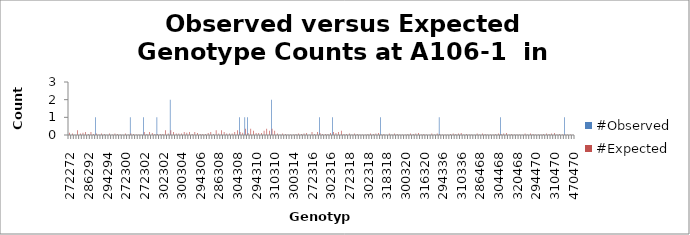
| Category | #Observed | #Expected |
|---|---|---|
| 272272.0 | 0 | 0.132 |
| 272286.0 | 0 | 0.088 |
| 286286.0 | 0 | 0.015 |
| 272290.0 | 0 | 0.265 |
| 286290.0 | 0 | 0.088 |
| 290290.0 | 0 | 0.132 |
| 272292.0 | 0 | 0.176 |
| 286292.0 | 0 | 0.059 |
| 290292.0 | 0 | 0.176 |
| 292292.0 | 0 | 0.059 |
| 272294.0 | 1 | 0.088 |
| 286294.0 | 0 | 0.029 |
| 290294.0 | 0 | 0.088 |
| 292294.0 | 0 | 0.059 |
| 294294.0 | 0 | 0.015 |
| 272296.0 | 0 | 0.088 |
| 286296.0 | 0 | 0.029 |
| 290296.0 | 0 | 0.088 |
| 292296.0 | 0 | 0.059 |
| 294296.0 | 0 | 0.029 |
| 296296.0 | 0 | 0.015 |
| 272300.0 | 0 | 0.088 |
| 286300.0 | 0 | 0.029 |
| 290300.0 | 1 | 0.088 |
| 292300.0 | 0 | 0.059 |
| 294300.0 | 0 | 0.029 |
| 296300.0 | 0 | 0.029 |
| 300300.0 | 0 | 0.015 |
| 272302.0 | 1 | 0.176 |
| 286302.0 | 0 | 0.059 |
| 290302.0 | 0 | 0.176 |
| 292302.0 | 0 | 0.118 |
| 294302.0 | 0 | 0.059 |
| 296302.0 | 1 | 0.059 |
| 300302.0 | 0 | 0.059 |
| 302302.0 | 0 | 0.059 |
| 272304.0 | 0 | 0.265 |
| 286304.0 | 0 | 0.088 |
| 290304.0 | 2 | 0.265 |
| 292304.0 | 0 | 0.176 |
| 294304.0 | 0 | 0.088 |
| 296304.0 | 0 | 0.088 |
| 300304.0 | 0 | 0.088 |
| 302304.0 | 0 | 0.176 |
| 304304.0 | 0 | 0.132 |
| 272306.0 | 0 | 0.176 |
| 286306.0 | 0 | 0.059 |
| 290306.0 | 0 | 0.176 |
| 292306.0 | 0 | 0.118 |
| 294306.0 | 0 | 0.059 |
| 296306.0 | 0 | 0.059 |
| 300306.0 | 0 | 0.059 |
| 302306.0 | 0 | 0.118 |
| 304306.0 | 0 | 0.176 |
| 306306.0 | 0 | 0.059 |
| 272308.0 | 0 | 0.265 |
| 286308.0 | 0 | 0.088 |
| 290308.0 | 0 | 0.265 |
| 292308.0 | 0 | 0.176 |
| 294308.0 | 0 | 0.088 |
| 296308.0 | 0 | 0.088 |
| 300308.0 | 0 | 0.088 |
| 302308.0 | 0 | 0.176 |
| 304308.0 | 0 | 0.265 |
| 306308.0 | 1 | 0.176 |
| 308308.0 | 0 | 0.132 |
| 272310.0 | 1 | 0.353 |
| 286310.0 | 1 | 0.118 |
| 290310.0 | 0 | 0.353 |
| 292310.0 | 0 | 0.235 |
| 294310.0 | 0 | 0.118 |
| 296310.0 | 0 | 0.118 |
| 300310.0 | 0 | 0.118 |
| 302310.0 | 0 | 0.235 |
| 304310.0 | 0 | 0.353 |
| 306310.0 | 0 | 0.235 |
| 308310.0 | 2 | 0.353 |
| 310310.0 | 0 | 0.235 |
| 272314.0 | 0 | 0.088 |
| 286314.0 | 0 | 0.029 |
| 290314.0 | 0 | 0.088 |
| 292314.0 | 0 | 0.059 |
| 294314.0 | 0 | 0.029 |
| 296314.0 | 0 | 0.029 |
| 300314.0 | 0 | 0.029 |
| 302314.0 | 0 | 0.059 |
| 304314.0 | 0 | 0.088 |
| 306314.0 | 0 | 0.059 |
| 308314.0 | 0 | 0.088 |
| 310314.0 | 0 | 0.118 |
| 314314.0 | 0 | 0.015 |
| 272316.0 | 0 | 0.176 |
| 286316.0 | 0 | 0.059 |
| 290316.0 | 0 | 0.176 |
| 292316.0 | 1 | 0.118 |
| 294316.0 | 0 | 0.059 |
| 296316.0 | 0 | 0.059 |
| 300316.0 | 0 | 0.059 |
| 302316.0 | 0 | 0.118 |
| 304316.0 | 1 | 0.176 |
| 306316.0 | 0 | 0.118 |
| 308316.0 | 0 | 0.176 |
| 310316.0 | 0 | 0.235 |
| 314316.0 | 0 | 0.059 |
| 316316.0 | 0 | 0.059 |
| 272318.0 | 0 | 0.088 |
| 286318.0 | 0 | 0.029 |
| 290318.0 | 0 | 0.088 |
| 292318.0 | 0 | 0.059 |
| 294318.0 | 0 | 0.029 |
| 296318.0 | 0 | 0.029 |
| 300318.0 | 0 | 0.029 |
| 302318.0 | 0 | 0.059 |
| 304318.0 | 0 | 0.088 |
| 306318.0 | 0 | 0.059 |
| 308318.0 | 0 | 0.088 |
| 310318.0 | 0 | 0.118 |
| 314318.0 | 1 | 0.029 |
| 316318.0 | 0 | 0.059 |
| 318318.0 | 0 | 0.015 |
| 272320.0 | 0 | 0.088 |
| 286320.0 | 0 | 0.029 |
| 290320.0 | 0 | 0.088 |
| 292320.0 | 0 | 0.059 |
| 294320.0 | 0 | 0.029 |
| 296320.0 | 0 | 0.029 |
| 300320.0 | 0 | 0.029 |
| 302320.0 | 0 | 0.059 |
| 304320.0 | 0 | 0.088 |
| 306320.0 | 0 | 0.059 |
| 308320.0 | 0 | 0.088 |
| 310320.0 | 0 | 0.118 |
| 314320.0 | 0 | 0.029 |
| 316320.0 | 0 | 0.059 |
| 318320.0 | 0 | 0.029 |
| 320320.0 | 0 | 0.015 |
| 272336.0 | 0 | 0.088 |
| 286336.0 | 0 | 0.029 |
| 290336.0 | 0 | 0.088 |
| 292336.0 | 1 | 0.059 |
| 294336.0 | 0 | 0.029 |
| 296336.0 | 0 | 0.029 |
| 300336.0 | 0 | 0.029 |
| 302336.0 | 0 | 0.059 |
| 304336.0 | 0 | 0.088 |
| 306336.0 | 0 | 0.059 |
| 308336.0 | 0 | 0.088 |
| 310336.0 | 0 | 0.118 |
| 314336.0 | 0 | 0.029 |
| 316336.0 | 0 | 0.059 |
| 318336.0 | 0 | 0.029 |
| 320336.0 | 0 | 0.029 |
| 336336.0 | 0 | 0.015 |
| 272468.0 | 0 | 0.088 |
| 286468.0 | 0 | 0.029 |
| 290468.0 | 0 | 0.088 |
| 292468.0 | 0 | 0.059 |
| 294468.0 | 0 | 0.029 |
| 296468.0 | 0 | 0.029 |
| 300468.0 | 0 | 0.029 |
| 302468.0 | 0 | 0.059 |
| 304468.0 | 0 | 0.088 |
| 306468.0 | 1 | 0.059 |
| 308468.0 | 0 | 0.088 |
| 310468.0 | 0 | 0.118 |
| 314468.0 | 0 | 0.029 |
| 316468.0 | 0 | 0.059 |
| 318468.0 | 0 | 0.029 |
| 320468.0 | 0 | 0.029 |
| 336468.0 | 0 | 0.029 |
| 468468.0 | 0 | 0.015 |
| 272470.0 | 0 | 0.088 |
| 286470.0 | 0 | 0.029 |
| 290470.0 | 0 | 0.088 |
| 292470.0 | 0 | 0.059 |
| 294470.0 | 0 | 0.029 |
| 296470.0 | 0 | 0.029 |
| 300470.0 | 0 | 0.029 |
| 302470.0 | 0 | 0.059 |
| 304470.0 | 0 | 0.088 |
| 306470.0 | 0 | 0.059 |
| 308470.0 | 0 | 0.088 |
| 310470.0 | 0 | 0.118 |
| 314470.0 | 0 | 0.029 |
| 316470.0 | 0 | 0.059 |
| 318470.0 | 0 | 0.029 |
| 320470.0 | 1 | 0.029 |
| 336470.0 | 0 | 0.029 |
| 468470.0 | 0 | 0.029 |
| 470470.0 | 0 | 0.015 |